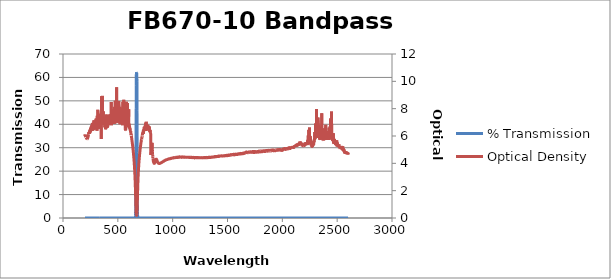
| Category | % Transmission |
|---|---|
| 2600.0 | 0.002 |
| 2599.0 | 0.002 |
| 2598.0 | 0.002 |
| 2597.0 | 0.002 |
| 2596.0 | 0.002 |
| 2595.0 | 0.002 |
| 2594.0 | 0.002 |
| 2593.0 | 0.002 |
| 2592.0 | 0.002 |
| 2591.0 | 0.002 |
| 2590.0 | 0.002 |
| 2589.0 | 0.002 |
| 2588.0 | 0.002 |
| 2587.0 | 0.002 |
| 2586.0 | 0.001 |
| 2585.0 | 0.002 |
| 2584.0 | 0.002 |
| 2583.0 | 0.002 |
| 2582.0 | 0.002 |
| 2581.0 | 0.002 |
| 2580.0 | 0.002 |
| 2579.0 | 0.002 |
| 2578.0 | 0.002 |
| 2577.0 | 0.001 |
| 2576.0 | 0.002 |
| 2575.0 | 0.002 |
| 2574.0 | 0.002 |
| 2573.0 | 0.002 |
| 2572.0 | 0.002 |
| 2571.0 | 0.002 |
| 2570.0 | 0.001 |
| 2569.0 | 0.002 |
| 2568.0 | 0.001 |
| 2567.0 | 0.002 |
| 2566.0 | 0.002 |
| 2565.0 | 0.001 |
| 2564.0 | 0.001 |
| 2563.0 | 0.001 |
| 2562.0 | 0.001 |
| 2561.0 | 0.001 |
| 2560.0 | 0.001 |
| 2559.0 | 0.001 |
| 2558.0 | 0.001 |
| 2557.0 | 0.001 |
| 2556.0 | 0.001 |
| 2555.0 | 0.001 |
| 2554.0 | 0.001 |
| 2553.0 | 0.001 |
| 2552.0 | 0.001 |
| 2551.0 | 0.001 |
| 2550.0 | 0.001 |
| 2549.0 | 0.001 |
| 2548.0 | 0.001 |
| 2547.0 | 0.001 |
| 2546.0 | 0.001 |
| 2545.0 | 0.001 |
| 2544.0 | 0.001 |
| 2543.0 | 0.001 |
| 2542.0 | 0.001 |
| 2541.0 | 0.001 |
| 2540.0 | 0.001 |
| 2539.0 | 0.001 |
| 2538.0 | 0.001 |
| 2537.0 | 0.001 |
| 2536.0 | 0.001 |
| 2535.0 | 0.001 |
| 2534.0 | 0.001 |
| 2533.0 | 0.001 |
| 2532.0 | 0.001 |
| 2531.0 | 0.001 |
| 2530.0 | 0.001 |
| 2529.0 | 0.001 |
| 2528.0 | 0.001 |
| 2527.0 | 0.001 |
| 2526.0 | 0.001 |
| 2525.0 | 0.001 |
| 2524.0 | 0.001 |
| 2523.0 | 0.001 |
| 2522.0 | 0.001 |
| 2521.0 | 0.001 |
| 2520.0 | 0.001 |
| 2519.0 | 0.001 |
| 2518.0 | 0.001 |
| 2517.0 | 0.001 |
| 2516.0 | 0 |
| 2515.0 | 0.001 |
| 2514.0 | 0.001 |
| 2513.0 | 0.001 |
| 2512.0 | 0 |
| 2511.0 | 0.001 |
| 2510.0 | 0 |
| 2509.0 | 0.001 |
| 2508.0 | 0.001 |
| 2507.0 | 0 |
| 2506.0 | 0.001 |
| 2505.0 | 0.001 |
| 2504.0 | 0 |
| 2503.0 | 0 |
| 2502.0 | 0 |
| 2501.0 | 0 |
| 2500.0 | 0 |
| 2499.0 | 0.001 |
| 2498.0 | 0.001 |
| 2497.0 | 0 |
| 2496.0 | 0 |
| 2495.0 | 0 |
| 2494.0 | 0 |
| 2493.0 | 0 |
| 2492.0 | 0 |
| 2491.0 | 0 |
| 2490.0 | 0 |
| 2489.0 | 0 |
| 2488.0 | 0 |
| 2487.0 | 0 |
| 2486.0 | 0 |
| 2485.0 | 0 |
| 2484.0 | 0 |
| 2483.0 | 0 |
| 2482.0 | 0 |
| 2481.0 | 0 |
| 2480.0 | 0 |
| 2479.0 | 0 |
| 2478.0 | 0 |
| 2477.0 | 0 |
| 2476.0 | 0 |
| 2475.0 | 0 |
| 2474.0 | 0 |
| 2473.0 | 0 |
| 2472.0 | 0 |
| 2471.0 | 0 |
| 2470.0 | 0 |
| 2469.0 | 0 |
| 2468.0 | 0 |
| 2467.0 | 0 |
| 2466.0 | 0 |
| 2465.0 | 0 |
| 2464.0 | 0 |
| 2463.0 | 0 |
| 2462.0 | 0 |
| 2461.0 | 0 |
| 2460.0 | 0 |
| 2459.0 | 0 |
| 2458.0 | 0 |
| 2457.0 | 0 |
| 2456.0 | 0 |
| 2455.0 | 0 |
| 2454.0 | 0 |
| 2453.0 | 0 |
| 2452.0 | 0 |
| 2451.0 | 0 |
| 2450.0 | 0 |
| 2449.0 | 0 |
| 2448.0 | 0 |
| 2447.0 | 0 |
| 2446.0 | 0 |
| 2445.0 | 0 |
| 2444.0 | 0 |
| 2443.0 | 0 |
| 2442.0 | 0 |
| 2441.0 | 0 |
| 2440.0 | 0 |
| 2439.0 | 0 |
| 2438.0 | 0 |
| 2437.0 | 0 |
| 2436.0 | 0 |
| 2435.0 | 0 |
| 2434.0 | 0 |
| 2433.0 | 0 |
| 2432.0 | 0 |
| 2431.0 | 0 |
| 2430.0 | 0 |
| 2429.0 | 0 |
| 2428.0 | 0 |
| 2427.0 | 0 |
| 2426.0 | 0 |
| 2425.0 | 0 |
| 2424.0 | 0 |
| 2423.0 | 0 |
| 2422.0 | 0 |
| 2421.0 | 0 |
| 2420.0 | 0 |
| 2419.0 | 0 |
| 2418.0 | 0 |
| 2417.0 | 0 |
| 2416.0 | 0 |
| 2415.0 | 0 |
| 2414.0 | 0 |
| 2413.0 | 0 |
| 2412.0 | 0 |
| 2411.0 | 0 |
| 2410.0 | 0 |
| 2409.0 | 0 |
| 2408.0 | 0 |
| 2407.0 | 0 |
| 2406.0 | 0 |
| 2405.0 | 0 |
| 2404.0 | 0 |
| 2403.0 | 0 |
| 2402.0 | 0 |
| 2401.0 | 0 |
| 2400.0 | 0 |
| 2399.0 | 0 |
| 2398.0 | 0 |
| 2397.0 | 0 |
| 2396.0 | 0 |
| 2395.0 | 0 |
| 2394.0 | 0 |
| 2393.0 | 0 |
| 2392.0 | 0 |
| 2391.0 | 0 |
| 2390.0 | 0 |
| 2389.0 | 0 |
| 2388.0 | 0 |
| 2387.0 | 0 |
| 2386.0 | 0 |
| 2385.0 | 0 |
| 2384.0 | 0 |
| 2383.0 | 0 |
| 2382.0 | 0 |
| 2381.0 | 0 |
| 2380.0 | 0 |
| 2379.0 | 0 |
| 2378.0 | 0 |
| 2377.0 | 0 |
| 2376.0 | 0 |
| 2375.0 | 0 |
| 2374.0 | 0 |
| 2373.0 | 0 |
| 2372.0 | 0 |
| 2371.0 | 0 |
| 2370.0 | 0 |
| 2369.0 | 0 |
| 2368.0 | 0 |
| 2367.0 | 0 |
| 2366.0 | 0 |
| 2365.0 | 0 |
| 2364.0 | 0 |
| 2363.0 | 0 |
| 2362.0 | 0 |
| 2361.0 | 0 |
| 2360.0 | 0 |
| 2359.0 | 0 |
| 2358.0 | 0 |
| 2357.0 | 0 |
| 2356.0 | 0 |
| 2355.0 | 0 |
| 2354.0 | 0 |
| 2353.0 | 0 |
| 2352.0 | 0 |
| 2351.0 | 0 |
| 2350.0 | 0 |
| 2349.0 | 0 |
| 2348.0 | 0 |
| 2347.0 | 0 |
| 2346.0 | 0 |
| 2345.0 | 0 |
| 2344.0 | 0 |
| 2343.0 | 0 |
| 2342.0 | 0 |
| 2341.0 | 0 |
| 2340.0 | 0 |
| 2339.0 | 0 |
| 2338.0 | 0 |
| 2337.0 | 0 |
| 2336.0 | 0 |
| 2335.0 | 0 |
| 2334.0 | 0 |
| 2333.0 | 0 |
| 2332.0 | 0 |
| 2331.0 | 0 |
| 2330.0 | 0 |
| 2329.0 | 0 |
| 2328.0 | 0 |
| 2327.0 | 0 |
| 2326.0 | 0 |
| 2325.0 | 0 |
| 2324.0 | 0 |
| 2323.0 | 0 |
| 2322.0 | 0 |
| 2321.0 | 0 |
| 2320.0 | 0 |
| 2319.0 | 0 |
| 2318.0 | 0 |
| 2317.0 | 0 |
| 2316.0 | 0 |
| 2315.0 | 0 |
| 2314.0 | 0 |
| 2313.0 | 0 |
| 2312.0 | 0 |
| 2311.0 | 0 |
| 2310.0 | 0 |
| 2309.0 | 0 |
| 2308.0 | 0 |
| 2307.0 | 0 |
| 2306.0 | 0 |
| 2305.0 | 0 |
| 2304.0 | 0 |
| 2303.0 | 0 |
| 2302.0 | 0 |
| 2301.0 | 0 |
| 2300.0 | 0 |
| 2299.0 | 0 |
| 2298.0 | 0 |
| 2297.0 | 0 |
| 2296.0 | 0 |
| 2295.0 | 0 |
| 2294.0 | 0 |
| 2293.0 | 0 |
| 2292.0 | 0 |
| 2291.0 | 0 |
| 2290.0 | 0 |
| 2289.0 | 0 |
| 2288.0 | 0 |
| 2287.0 | 0 |
| 2286.0 | 0 |
| 2285.0 | 0 |
| 2284.0 | 0 |
| 2283.0 | 0 |
| 2282.0 | 0 |
| 2281.0 | 0 |
| 2280.0 | 0 |
| 2279.0 | 0 |
| 2278.0 | 0 |
| 2277.0 | 0 |
| 2276.0 | 0.001 |
| 2275.0 | 0 |
| 2274.0 | 0.001 |
| 2273.0 | 0.001 |
| 2272.0 | 0.001 |
| 2271.0 | 0.001 |
| 2270.0 | 0.001 |
| 2269.0 | 0 |
| 2268.0 | 0.001 |
| 2267.0 | 0 |
| 2266.0 | 0 |
| 2265.0 | 0 |
| 2264.0 | 0 |
| 2263.0 | 0 |
| 2262.0 | 0 |
| 2261.0 | 0 |
| 2260.0 | 0 |
| 2259.0 | 0 |
| 2258.0 | 0 |
| 2257.0 | 0 |
| 2256.0 | 0 |
| 2255.0 | 0 |
| 2254.0 | 0 |
| 2253.0 | 0 |
| 2252.0 | 0 |
| 2251.0 | 0 |
| 2250.0 | 0 |
| 2249.0 | 0 |
| 2248.0 | 0 |
| 2247.0 | 0 |
| 2246.0 | 0 |
| 2245.0 | 0 |
| 2244.0 | 0 |
| 2243.0 | 0 |
| 2242.0 | 0 |
| 2241.0 | 0 |
| 2240.0 | 0 |
| 2239.0 | 0 |
| 2238.0 | 0 |
| 2237.0 | 0 |
| 2236.0 | 0 |
| 2235.0 | 0 |
| 2234.0 | 0 |
| 2233.0 | 0 |
| 2232.0 | 0 |
| 2231.0 | 0 |
| 2230.0 | 0 |
| 2229.0 | 0 |
| 2228.0 | 0 |
| 2227.0 | 0 |
| 2226.0 | 0 |
| 2225.0 | 0 |
| 2224.0 | 0 |
| 2223.0 | 0 |
| 2222.0 | 0 |
| 2221.0 | 0 |
| 2220.0 | 0 |
| 2219.0 | 0 |
| 2218.0 | 0 |
| 2217.0 | 0 |
| 2216.0 | 0 |
| 2215.0 | 0 |
| 2214.0 | 0 |
| 2213.0 | 0 |
| 2212.0 | 0 |
| 2211.0 | 0 |
| 2210.0 | 0 |
| 2209.0 | 0 |
| 2208.0 | 0 |
| 2207.0 | 0.001 |
| 2206.0 | 0.001 |
| 2205.0 | 0 |
| 2204.0 | 0 |
| 2203.0 | 0 |
| 2202.0 | 0 |
| 2201.0 | 0 |
| 2200.0 | 0.001 |
| 2199.0 | 0 |
| 2198.0 | 0.001 |
| 2197.0 | 0 |
| 2196.0 | 0 |
| 2195.0 | 0 |
| 2194.0 | 0 |
| 2193.0 | 0 |
| 2192.0 | 0 |
| 2191.0 | 0 |
| 2190.0 | 0 |
| 2189.0 | 0.001 |
| 2188.0 | 0 |
| 2187.0 | 0 |
| 2186.0 | 0.001 |
| 2185.0 | 0 |
| 2184.0 | 0 |
| 2183.0 | 0 |
| 2182.0 | 0 |
| 2181.0 | 0 |
| 2180.0 | 0 |
| 2179.0 | 0 |
| 2178.0 | 0 |
| 2177.0 | 0 |
| 2176.0 | 0 |
| 2175.0 | 0 |
| 2174.0 | 0 |
| 2173.0 | 0 |
| 2172.0 | 0 |
| 2171.0 | 0 |
| 2170.0 | 0 |
| 2169.0 | 0 |
| 2168.0 | 0 |
| 2167.0 | 0 |
| 2166.0 | 0 |
| 2165.0 | 0 |
| 2164.0 | 0 |
| 2163.0 | 0 |
| 2162.0 | 0 |
| 2161.0 | 0 |
| 2160.0 | 0 |
| 2159.0 | 0 |
| 2158.0 | 0 |
| 2157.0 | 0 |
| 2156.0 | 0 |
| 2155.0 | 0 |
| 2154.0 | 0 |
| 2153.0 | 0 |
| 2152.0 | 0 |
| 2151.0 | 0 |
| 2150.0 | 0 |
| 2149.0 | 0 |
| 2148.0 | 0 |
| 2147.0 | 0 |
| 2146.0 | 0 |
| 2145.0 | 0 |
| 2144.0 | 0 |
| 2143.0 | 0 |
| 2142.0 | 0 |
| 2141.0 | 0 |
| 2140.0 | 0 |
| 2139.0 | 0 |
| 2138.0 | 0 |
| 2137.0 | 0 |
| 2136.0 | 0 |
| 2135.0 | 0 |
| 2134.0 | 0 |
| 2133.0 | 0.001 |
| 2132.0 | 0 |
| 2131.0 | 0 |
| 2130.0 | 0 |
| 2129.0 | 0 |
| 2128.0 | 0 |
| 2127.0 | 0.001 |
| 2126.0 | 0 |
| 2125.0 | 0.001 |
| 2124.0 | 0.001 |
| 2123.0 | 0.001 |
| 2122.0 | 0.001 |
| 2121.0 | 0 |
| 2120.0 | 0.001 |
| 2119.0 | 0 |
| 2118.0 | 0.001 |
| 2117.0 | 0.001 |
| 2116.0 | 0.001 |
| 2115.0 | 0.001 |
| 2114.0 | 0.001 |
| 2113.0 | 0.001 |
| 2112.0 | 0.001 |
| 2111.0 | 0.001 |
| 2110.0 | 0.001 |
| 2109.0 | 0.001 |
| 2108.0 | 0.001 |
| 2107.0 | 0.001 |
| 2106.0 | 0.001 |
| 2105.0 | 0.001 |
| 2104.0 | 0.001 |
| 2103.0 | 0.001 |
| 2102.0 | 0.001 |
| 2101.0 | 0.001 |
| 2100.0 | 0.001 |
| 2099.0 | 0.001 |
| 2098.0 | 0.001 |
| 2097.0 | 0.001 |
| 2096.0 | 0.001 |
| 2095.0 | 0.001 |
| 2094.0 | 0.001 |
| 2093.0 | 0.001 |
| 2092.0 | 0.001 |
| 2091.0 | 0.001 |
| 2090.0 | 0.001 |
| 2089.0 | 0.001 |
| 2088.0 | 0.001 |
| 2087.0 | 0.001 |
| 2086.0 | 0.001 |
| 2085.0 | 0.001 |
| 2084.0 | 0.001 |
| 2083.0 | 0.001 |
| 2082.0 | 0.001 |
| 2081.0 | 0.001 |
| 2080.0 | 0.001 |
| 2079.0 | 0.001 |
| 2078.0 | 0.001 |
| 2077.0 | 0.001 |
| 2076.0 | 0.001 |
| 2075.0 | 0.001 |
| 2074.0 | 0.001 |
| 2073.0 | 0.001 |
| 2072.0 | 0.001 |
| 2071.0 | 0.001 |
| 2070.0 | 0.001 |
| 2069.0 | 0.001 |
| 2068.0 | 0.001 |
| 2067.0 | 0.001 |
| 2066.0 | 0.001 |
| 2065.0 | 0.001 |
| 2064.0 | 0.001 |
| 2063.0 | 0.001 |
| 2062.0 | 0.001 |
| 2061.0 | 0.001 |
| 2060.0 | 0.001 |
| 2059.0 | 0.001 |
| 2058.0 | 0.001 |
| 2057.0 | 0.001 |
| 2056.0 | 0.001 |
| 2055.0 | 0.001 |
| 2054.0 | 0.001 |
| 2053.0 | 0.001 |
| 2052.0 | 0.001 |
| 2051.0 | 0.001 |
| 2050.0 | 0.001 |
| 2049.0 | 0.001 |
| 2048.0 | 0.001 |
| 2047.0 | 0.001 |
| 2046.0 | 0.001 |
| 2045.0 | 0.001 |
| 2044.0 | 0.001 |
| 2043.0 | 0.001 |
| 2042.0 | 0.001 |
| 2041.0 | 0.001 |
| 2040.0 | 0.001 |
| 2039.0 | 0.001 |
| 2038.0 | 0.001 |
| 2037.0 | 0.001 |
| 2036.0 | 0.001 |
| 2035.0 | 0.001 |
| 2034.0 | 0.001 |
| 2033.0 | 0.001 |
| 2032.0 | 0.001 |
| 2031.0 | 0.001 |
| 2030.0 | 0.001 |
| 2029.0 | 0.001 |
| 2028.0 | 0.001 |
| 2027.0 | 0.001 |
| 2026.0 | 0.001 |
| 2025.0 | 0.001 |
| 2024.0 | 0.001 |
| 2023.0 | 0.001 |
| 2022.0 | 0.001 |
| 2021.0 | 0.001 |
| 2020.0 | 0.001 |
| 2019.0 | 0.001 |
| 2018.0 | 0.001 |
| 2017.0 | 0.001 |
| 2016.0 | 0.001 |
| 2015.0 | 0.001 |
| 2014.0 | 0.001 |
| 2013.0 | 0.001 |
| 2012.0 | 0.001 |
| 2011.0 | 0.001 |
| 2010.0 | 0.001 |
| 2009.0 | 0.001 |
| 2008.0 | 0.001 |
| 2007.0 | 0.001 |
| 2006.0 | 0.001 |
| 2005.0 | 0.001 |
| 2004.0 | 0.001 |
| 2003.0 | 0.001 |
| 2002.0 | 0.001 |
| 2001.0 | 0.001 |
| 2000.0 | 0.001 |
| 1999.0 | 0.001 |
| 1998.0 | 0.001 |
| 1997.0 | 0.001 |
| 1996.0 | 0.001 |
| 1995.0 | 0.001 |
| 1994.0 | 0.001 |
| 1993.0 | 0.001 |
| 1992.0 | 0.001 |
| 1991.0 | 0.001 |
| 1990.0 | 0.001 |
| 1989.0 | 0.001 |
| 1988.0 | 0.001 |
| 1987.0 | 0.001 |
| 1986.0 | 0.001 |
| 1985.0 | 0.001 |
| 1984.0 | 0.001 |
| 1983.0 | 0.001 |
| 1982.0 | 0.001 |
| 1981.0 | 0.001 |
| 1980.0 | 0.001 |
| 1979.0 | 0.001 |
| 1978.0 | 0.001 |
| 1977.0 | 0.001 |
| 1976.0 | 0.001 |
| 1975.0 | 0.001 |
| 1974.0 | 0.001 |
| 1973.0 | 0.001 |
| 1972.0 | 0.001 |
| 1971.0 | 0.001 |
| 1970.0 | 0.001 |
| 1969.0 | 0.001 |
| 1968.0 | 0.001 |
| 1967.0 | 0.001 |
| 1966.0 | 0.001 |
| 1965.0 | 0.001 |
| 1964.0 | 0.001 |
| 1963.0 | 0.001 |
| 1962.0 | 0.001 |
| 1961.0 | 0.001 |
| 1960.0 | 0.001 |
| 1959.0 | 0.001 |
| 1958.0 | 0.001 |
| 1957.0 | 0.001 |
| 1956.0 | 0.001 |
| 1955.0 | 0.001 |
| 1954.0 | 0.001 |
| 1953.0 | 0.001 |
| 1952.0 | 0.001 |
| 1951.0 | 0.001 |
| 1950.0 | 0.001 |
| 1949.0 | 0.001 |
| 1948.0 | 0.001 |
| 1947.0 | 0.001 |
| 1946.0 | 0.001 |
| 1945.0 | 0.001 |
| 1944.0 | 0.001 |
| 1943.0 | 0.001 |
| 1942.0 | 0.001 |
| 1941.0 | 0.001 |
| 1940.0 | 0.001 |
| 1939.0 | 0.001 |
| 1938.0 | 0.001 |
| 1937.0 | 0.001 |
| 1936.0 | 0.001 |
| 1935.0 | 0.001 |
| 1934.0 | 0.001 |
| 1933.0 | 0.001 |
| 1932.0 | 0.001 |
| 1931.0 | 0.001 |
| 1930.0 | 0.001 |
| 1929.0 | 0.001 |
| 1928.0 | 0.001 |
| 1927.0 | 0.001 |
| 1926.0 | 0.001 |
| 1925.0 | 0.001 |
| 1924.0 | 0.001 |
| 1923.0 | 0.001 |
| 1922.0 | 0.001 |
| 1921.0 | 0.001 |
| 1920.0 | 0.001 |
| 1919.0 | 0.001 |
| 1918.0 | 0.001 |
| 1917.0 | 0.001 |
| 1916.0 | 0.001 |
| 1915.0 | 0.001 |
| 1914.0 | 0.001 |
| 1913.0 | 0.001 |
| 1912.0 | 0.001 |
| 1911.0 | 0.001 |
| 1910.0 | 0.001 |
| 1909.0 | 0.001 |
| 1908.0 | 0.001 |
| 1907.0 | 0.001 |
| 1906.0 | 0.001 |
| 1905.0 | 0.001 |
| 1904.0 | 0.001 |
| 1903.0 | 0.001 |
| 1902.0 | 0.001 |
| 1901.0 | 0.001 |
| 1900.0 | 0.001 |
| 1899.0 | 0.001 |
| 1898.0 | 0.001 |
| 1897.0 | 0.001 |
| 1896.0 | 0.001 |
| 1895.0 | 0.001 |
| 1894.0 | 0.001 |
| 1893.0 | 0.001 |
| 1892.0 | 0.001 |
| 1891.0 | 0.001 |
| 1890.0 | 0.001 |
| 1889.0 | 0.001 |
| 1888.0 | 0.001 |
| 1887.0 | 0.001 |
| 1886.0 | 0.001 |
| 1885.0 | 0.001 |
| 1884.0 | 0.001 |
| 1883.0 | 0.001 |
| 1882.0 | 0.001 |
| 1881.0 | 0.001 |
| 1880.0 | 0.001 |
| 1879.0 | 0.001 |
| 1878.0 | 0.001 |
| 1877.0 | 0.001 |
| 1876.0 | 0.001 |
| 1875.0 | 0.001 |
| 1874.0 | 0.001 |
| 1873.0 | 0.001 |
| 1872.0 | 0.001 |
| 1871.0 | 0.001 |
| 1870.0 | 0.001 |
| 1869.0 | 0.001 |
| 1868.0 | 0.001 |
| 1867.0 | 0.001 |
| 1866.0 | 0.001 |
| 1865.0 | 0.001 |
| 1864.0 | 0.001 |
| 1863.0 | 0.001 |
| 1862.0 | 0.001 |
| 1861.0 | 0.001 |
| 1860.0 | 0.001 |
| 1859.0 | 0.001 |
| 1858.0 | 0.001 |
| 1857.0 | 0.001 |
| 1856.0 | 0.001 |
| 1855.0 | 0.001 |
| 1854.0 | 0.001 |
| 1853.0 | 0.001 |
| 1852.0 | 0.001 |
| 1851.0 | 0.001 |
| 1850.0 | 0.001 |
| 1849.0 | 0.001 |
| 1848.0 | 0.001 |
| 1847.0 | 0.001 |
| 1846.0 | 0.001 |
| 1845.0 | 0.001 |
| 1844.0 | 0.001 |
| 1843.0 | 0.001 |
| 1842.0 | 0.001 |
| 1841.0 | 0.001 |
| 1840.0 | 0.001 |
| 1839.0 | 0.001 |
| 1838.0 | 0.001 |
| 1837.0 | 0.001 |
| 1836.0 | 0.001 |
| 1835.0 | 0.001 |
| 1834.0 | 0.001 |
| 1833.0 | 0.001 |
| 1832.0 | 0.001 |
| 1831.0 | 0.001 |
| 1830.0 | 0.001 |
| 1829.0 | 0.001 |
| 1828.0 | 0.001 |
| 1827.0 | 0.001 |
| 1826.0 | 0.001 |
| 1825.0 | 0.001 |
| 1824.0 | 0.001 |
| 1823.0 | 0.001 |
| 1822.0 | 0.001 |
| 1821.0 | 0.001 |
| 1820.0 | 0.001 |
| 1819.0 | 0.001 |
| 1818.0 | 0.001 |
| 1817.0 | 0.001 |
| 1816.0 | 0.001 |
| 1815.0 | 0.001 |
| 1814.0 | 0.001 |
| 1813.0 | 0.001 |
| 1812.0 | 0.001 |
| 1811.0 | 0.001 |
| 1810.0 | 0.001 |
| 1809.0 | 0.001 |
| 1808.0 | 0.001 |
| 1807.0 | 0.001 |
| 1806.0 | 0.001 |
| 1805.0 | 0.001 |
| 1804.0 | 0.001 |
| 1803.0 | 0.001 |
| 1802.0 | 0.001 |
| 1801.0 | 0.001 |
| 1800.0 | 0.001 |
| 1799.0 | 0.001 |
| 1798.0 | 0.001 |
| 1797.0 | 0.001 |
| 1796.0 | 0.001 |
| 1795.0 | 0.001 |
| 1794.0 | 0.001 |
| 1793.0 | 0.001 |
| 1792.0 | 0.001 |
| 1791.0 | 0.001 |
| 1790.0 | 0.001 |
| 1789.0 | 0.001 |
| 1788.0 | 0.001 |
| 1787.0 | 0.002 |
| 1786.0 | 0.001 |
| 1785.0 | 0.001 |
| 1784.0 | 0.001 |
| 1783.0 | 0.001 |
| 1782.0 | 0.001 |
| 1781.0 | 0.001 |
| 1780.0 | 0.001 |
| 1779.0 | 0.002 |
| 1778.0 | 0.001 |
| 1777.0 | 0.001 |
| 1776.0 | 0.001 |
| 1775.0 | 0.001 |
| 1774.0 | 0.001 |
| 1773.0 | 0.002 |
| 1772.0 | 0.001 |
| 1771.0 | 0.001 |
| 1770.0 | 0.001 |
| 1769.0 | 0.001 |
| 1768.0 | 0.001 |
| 1767.0 | 0.001 |
| 1766.0 | 0.002 |
| 1765.0 | 0.001 |
| 1764.0 | 0.002 |
| 1763.0 | 0.002 |
| 1762.0 | 0.001 |
| 1761.0 | 0.002 |
| 1760.0 | 0.001 |
| 1759.0 | 0.001 |
| 1758.0 | 0.002 |
| 1757.0 | 0.002 |
| 1756.0 | 0.002 |
| 1755.0 | 0.002 |
| 1754.0 | 0.001 |
| 1753.0 | 0.002 |
| 1752.0 | 0.001 |
| 1751.0 | 0.001 |
| 1750.0 | 0.002 |
| 1749.0 | 0.002 |
| 1748.0 | 0.002 |
| 1747.0 | 0.002 |
| 1746.0 | 0.001 |
| 1745.0 | 0.001 |
| 1744.0 | 0.001 |
| 1743.0 | 0.002 |
| 1742.0 | 0.001 |
| 1741.0 | 0.002 |
| 1740.0 | 0.002 |
| 1739.0 | 0.001 |
| 1738.0 | 0.001 |
| 1737.0 | 0.001 |
| 1736.0 | 0.002 |
| 1735.0 | 0.001 |
| 1734.0 | 0.001 |
| 1733.0 | 0.002 |
| 1732.0 | 0.001 |
| 1731.0 | 0.002 |
| 1730.0 | 0.001 |
| 1729.0 | 0.001 |
| 1728.0 | 0.001 |
| 1727.0 | 0.001 |
| 1726.0 | 0.002 |
| 1725.0 | 0.001 |
| 1724.0 | 0.002 |
| 1723.0 | 0.001 |
| 1722.0 | 0.002 |
| 1721.0 | 0.002 |
| 1720.0 | 0.001 |
| 1719.0 | 0.001 |
| 1718.0 | 0.001 |
| 1717.0 | 0.001 |
| 1716.0 | 0.001 |
| 1715.0 | 0.002 |
| 1714.0 | 0.002 |
| 1713.0 | 0.002 |
| 1712.0 | 0.001 |
| 1711.0 | 0.002 |
| 1710.0 | 0.002 |
| 1709.0 | 0.001 |
| 1708.0 | 0.001 |
| 1707.0 | 0.001 |
| 1706.0 | 0.001 |
| 1705.0 | 0.002 |
| 1704.0 | 0.001 |
| 1703.0 | 0.001 |
| 1702.0 | 0.002 |
| 1701.0 | 0.001 |
| 1700.0 | 0.002 |
| 1699.0 | 0.002 |
| 1698.0 | 0.002 |
| 1697.0 | 0.001 |
| 1696.0 | 0.001 |
| 1695.0 | 0.001 |
| 1694.0 | 0.002 |
| 1693.0 | 0.002 |
| 1692.0 | 0.002 |
| 1691.0 | 0.002 |
| 1690.0 | 0.002 |
| 1689.0 | 0.002 |
| 1688.0 | 0.002 |
| 1687.0 | 0.002 |
| 1686.0 | 0.002 |
| 1685.0 | 0.002 |
| 1684.0 | 0.002 |
| 1683.0 | 0.002 |
| 1682.0 | 0.002 |
| 1681.0 | 0.002 |
| 1680.0 | 0.002 |
| 1679.0 | 0.002 |
| 1678.0 | 0.002 |
| 1677.0 | 0.002 |
| 1676.0 | 0.002 |
| 1675.0 | 0.002 |
| 1674.0 | 0.002 |
| 1673.0 | 0.002 |
| 1672.0 | 0.001 |
| 1671.0 | 0.002 |
| 1670.0 | 0.002 |
| 1669.0 | 0.002 |
| 1668.0 | 0.002 |
| 1667.0 | 0.002 |
| 1666.0 | 0.002 |
| 1665.0 | 0.002 |
| 1664.0 | 0.002 |
| 1663.0 | 0.002 |
| 1662.0 | 0.002 |
| 1661.0 | 0.002 |
| 1660.0 | 0.002 |
| 1659.0 | 0.002 |
| 1658.0 | 0.002 |
| 1657.0 | 0.002 |
| 1656.0 | 0.002 |
| 1655.0 | 0.002 |
| 1654.0 | 0.002 |
| 1653.0 | 0.002 |
| 1652.0 | 0.002 |
| 1651.0 | 0.002 |
| 1650.0 | 0.002 |
| 1649.0 | 0.002 |
| 1648.0 | 0.002 |
| 1647.0 | 0.002 |
| 1646.0 | 0.002 |
| 1645.0 | 0.002 |
| 1644.0 | 0.002 |
| 1643.0 | 0.002 |
| 1642.0 | 0.002 |
| 1641.0 | 0.002 |
| 1640.0 | 0.002 |
| 1639.0 | 0.002 |
| 1638.0 | 0.002 |
| 1637.0 | 0.002 |
| 1636.0 | 0.002 |
| 1635.0 | 0.002 |
| 1634.0 | 0.002 |
| 1633.0 | 0.002 |
| 1632.0 | 0.002 |
| 1631.0 | 0.002 |
| 1630.0 | 0.002 |
| 1629.0 | 0.002 |
| 1628.0 | 0.002 |
| 1627.0 | 0.002 |
| 1626.0 | 0.002 |
| 1625.0 | 0.002 |
| 1624.0 | 0.002 |
| 1623.0 | 0.002 |
| 1622.0 | 0.002 |
| 1621.0 | 0.002 |
| 1620.0 | 0.002 |
| 1619.0 | 0.002 |
| 1618.0 | 0.002 |
| 1617.0 | 0.002 |
| 1616.0 | 0.002 |
| 1615.0 | 0.002 |
| 1614.0 | 0.002 |
| 1613.0 | 0.002 |
| 1612.0 | 0.002 |
| 1611.0 | 0.002 |
| 1610.0 | 0.002 |
| 1609.0 | 0.002 |
| 1608.0 | 0.002 |
| 1607.0 | 0.002 |
| 1606.0 | 0.002 |
| 1605.0 | 0.002 |
| 1604.0 | 0.002 |
| 1603.0 | 0.002 |
| 1602.0 | 0.002 |
| 1601.0 | 0.002 |
| 1600.0 | 0.002 |
| 1599.0 | 0.002 |
| 1598.0 | 0.002 |
| 1597.0 | 0.002 |
| 1596.0 | 0.002 |
| 1595.0 | 0.002 |
| 1594.0 | 0.002 |
| 1593.0 | 0.002 |
| 1592.0 | 0.002 |
| 1591.0 | 0.002 |
| 1590.0 | 0.002 |
| 1589.0 | 0.002 |
| 1588.0 | 0.002 |
| 1587.0 | 0.002 |
| 1586.0 | 0.002 |
| 1585.0 | 0.002 |
| 1584.0 | 0.002 |
| 1583.0 | 0.002 |
| 1582.0 | 0.002 |
| 1581.0 | 0.002 |
| 1580.0 | 0.002 |
| 1579.0 | 0.002 |
| 1578.0 | 0.002 |
| 1577.0 | 0.002 |
| 1576.0 | 0.002 |
| 1575.0 | 0.002 |
| 1574.0 | 0.002 |
| 1573.0 | 0.002 |
| 1572.0 | 0.002 |
| 1571.0 | 0.002 |
| 1570.0 | 0.002 |
| 1569.0 | 0.002 |
| 1568.0 | 0.002 |
| 1567.0 | 0.002 |
| 1566.0 | 0.002 |
| 1565.0 | 0.002 |
| 1564.0 | 0.002 |
| 1563.0 | 0.002 |
| 1562.0 | 0.002 |
| 1561.0 | 0.002 |
| 1560.0 | 0.002 |
| 1559.0 | 0.002 |
| 1558.0 | 0.002 |
| 1557.0 | 0.002 |
| 1556.0 | 0.002 |
| 1555.0 | 0.002 |
| 1554.0 | 0.002 |
| 1553.0 | 0.002 |
| 1552.0 | 0.002 |
| 1551.0 | 0.002 |
| 1550.0 | 0.002 |
| 1549.0 | 0.002 |
| 1548.0 | 0.002 |
| 1547.0 | 0.002 |
| 1546.0 | 0.002 |
| 1545.0 | 0.002 |
| 1544.0 | 0.002 |
| 1543.0 | 0.002 |
| 1542.0 | 0.002 |
| 1541.0 | 0.002 |
| 1540.0 | 0.002 |
| 1539.0 | 0.002 |
| 1538.0 | 0.002 |
| 1537.0 | 0.002 |
| 1536.0 | 0.002 |
| 1535.0 | 0.002 |
| 1534.0 | 0.002 |
| 1533.0 | 0.002 |
| 1532.0 | 0.002 |
| 1531.0 | 0.002 |
| 1530.0 | 0.002 |
| 1529.0 | 0.003 |
| 1528.0 | 0.002 |
| 1527.0 | 0.002 |
| 1526.0 | 0.002 |
| 1525.0 | 0.003 |
| 1524.0 | 0.003 |
| 1523.0 | 0.003 |
| 1522.0 | 0.002 |
| 1521.0 | 0.002 |
| 1520.0 | 0.003 |
| 1519.0 | 0.002 |
| 1518.0 | 0.003 |
| 1517.0 | 0.003 |
| 1516.0 | 0.003 |
| 1515.0 | 0.003 |
| 1514.0 | 0.003 |
| 1513.0 | 0.003 |
| 1512.0 | 0.002 |
| 1511.0 | 0.003 |
| 1510.0 | 0.003 |
| 1509.0 | 0.003 |
| 1508.0 | 0.003 |
| 1507.0 | 0.003 |
| 1506.0 | 0.003 |
| 1505.0 | 0.003 |
| 1504.0 | 0.003 |
| 1503.0 | 0.003 |
| 1502.0 | 0.003 |
| 1501.0 | 0.003 |
| 1500.0 | 0.003 |
| 1499.0 | 0.003 |
| 1498.0 | 0.003 |
| 1497.0 | 0.003 |
| 1496.0 | 0.003 |
| 1495.0 | 0.003 |
| 1494.0 | 0.003 |
| 1493.0 | 0.003 |
| 1492.0 | 0.003 |
| 1491.0 | 0.003 |
| 1490.0 | 0.003 |
| 1489.0 | 0.003 |
| 1488.0 | 0.003 |
| 1487.0 | 0.003 |
| 1486.0 | 0.003 |
| 1485.0 | 0.003 |
| 1484.0 | 0.003 |
| 1483.0 | 0.003 |
| 1482.0 | 0.003 |
| 1481.0 | 0.003 |
| 1480.0 | 0.003 |
| 1479.0 | 0.003 |
| 1478.0 | 0.003 |
| 1477.0 | 0.003 |
| 1476.0 | 0.003 |
| 1475.0 | 0.003 |
| 1474.0 | 0.003 |
| 1473.0 | 0.003 |
| 1472.0 | 0.003 |
| 1471.0 | 0.003 |
| 1470.0 | 0.003 |
| 1469.0 | 0.003 |
| 1468.0 | 0.003 |
| 1467.0 | 0.003 |
| 1466.0 | 0.003 |
| 1465.0 | 0.003 |
| 1464.0 | 0.003 |
| 1463.0 | 0.003 |
| 1462.0 | 0.003 |
| 1461.0 | 0.003 |
| 1460.0 | 0.003 |
| 1459.0 | 0.003 |
| 1458.0 | 0.003 |
| 1457.0 | 0.003 |
| 1456.0 | 0.003 |
| 1455.0 | 0.003 |
| 1454.0 | 0.003 |
| 1453.0 | 0.003 |
| 1452.0 | 0.003 |
| 1451.0 | 0.003 |
| 1450.0 | 0.003 |
| 1449.0 | 0.003 |
| 1448.0 | 0.003 |
| 1447.0 | 0.003 |
| 1446.0 | 0.003 |
| 1445.0 | 0.003 |
| 1444.0 | 0.003 |
| 1443.0 | 0.003 |
| 1442.0 | 0.003 |
| 1441.0 | 0.003 |
| 1440.0 | 0.003 |
| 1439.0 | 0.003 |
| 1438.0 | 0.003 |
| 1437.0 | 0.003 |
| 1436.0 | 0.003 |
| 1435.0 | 0.003 |
| 1434.0 | 0.003 |
| 1433.0 | 0.003 |
| 1432.0 | 0.003 |
| 1431.0 | 0.003 |
| 1430.0 | 0.003 |
| 1429.0 | 0.003 |
| 1428.0 | 0.003 |
| 1427.0 | 0.003 |
| 1426.0 | 0.003 |
| 1425.0 | 0.003 |
| 1424.0 | 0.003 |
| 1423.0 | 0.003 |
| 1422.0 | 0.003 |
| 1421.0 | 0.003 |
| 1420.0 | 0.003 |
| 1419.0 | 0.003 |
| 1418.0 | 0.003 |
| 1417.0 | 0.003 |
| 1416.0 | 0.003 |
| 1415.0 | 0.003 |
| 1414.0 | 0.003 |
| 1413.0 | 0.003 |
| 1412.0 | 0.003 |
| 1411.0 | 0.003 |
| 1410.0 | 0.003 |
| 1409.0 | 0.003 |
| 1408.0 | 0.003 |
| 1407.0 | 0.003 |
| 1406.0 | 0.003 |
| 1405.0 | 0.003 |
| 1404.0 | 0.003 |
| 1403.0 | 0.003 |
| 1402.0 | 0.003 |
| 1401.0 | 0.003 |
| 1400.0 | 0.003 |
| 1399.0 | 0.003 |
| 1398.0 | 0.003 |
| 1397.0 | 0.003 |
| 1396.0 | 0.003 |
| 1395.0 | 0.003 |
| 1394.0 | 0.003 |
| 1393.0 | 0.003 |
| 1392.0 | 0.003 |
| 1391.0 | 0.003 |
| 1390.0 | 0.003 |
| 1389.0 | 0.003 |
| 1388.0 | 0.003 |
| 1387.0 | 0.003 |
| 1386.0 | 0.003 |
| 1385.0 | 0.003 |
| 1384.0 | 0.003 |
| 1383.0 | 0.003 |
| 1382.0 | 0.003 |
| 1381.0 | 0.003 |
| 1380.0 | 0.003 |
| 1379.0 | 0.003 |
| 1378.0 | 0.003 |
| 1377.0 | 0.003 |
| 1376.0 | 0.003 |
| 1375.0 | 0.003 |
| 1374.0 | 0.003 |
| 1373.0 | 0.003 |
| 1372.0 | 0.003 |
| 1371.0 | 0.003 |
| 1370.0 | 0.003 |
| 1369.0 | 0.004 |
| 1368.0 | 0.003 |
| 1367.0 | 0.003 |
| 1366.0 | 0.003 |
| 1365.0 | 0.003 |
| 1364.0 | 0.003 |
| 1363.0 | 0.004 |
| 1362.0 | 0.004 |
| 1361.0 | 0.004 |
| 1360.0 | 0.004 |
| 1359.0 | 0.004 |
| 1358.0 | 0.004 |
| 1357.0 | 0.003 |
| 1356.0 | 0.004 |
| 1355.0 | 0.004 |
| 1354.0 | 0.004 |
| 1353.0 | 0.004 |
| 1352.0 | 0.004 |
| 1351.0 | 0.004 |
| 1350.0 | 0.004 |
| 1349.0 | 0.004 |
| 1348.0 | 0.004 |
| 1347.0 | 0.004 |
| 1346.0 | 0.004 |
| 1345.0 | 0.004 |
| 1344.0 | 0.004 |
| 1343.0 | 0.004 |
| 1342.0 | 0.004 |
| 1341.0 | 0.004 |
| 1340.0 | 0.004 |
| 1339.0 | 0.004 |
| 1338.0 | 0.004 |
| 1337.0 | 0.004 |
| 1336.0 | 0.004 |
| 1335.0 | 0.004 |
| 1334.0 | 0.004 |
| 1333.0 | 0.004 |
| 1332.0 | 0.004 |
| 1331.0 | 0.004 |
| 1330.0 | 0.004 |
| 1329.0 | 0.004 |
| 1328.0 | 0.004 |
| 1327.0 | 0.004 |
| 1326.0 | 0.004 |
| 1325.0 | 0.004 |
| 1324.0 | 0.004 |
| 1323.0 | 0.004 |
| 1322.0 | 0.004 |
| 1321.0 | 0.004 |
| 1320.0 | 0.004 |
| 1319.0 | 0.004 |
| 1318.0 | 0.004 |
| 1317.0 | 0.004 |
| 1316.0 | 0.004 |
| 1315.0 | 0.004 |
| 1314.0 | 0.004 |
| 1313.0 | 0.004 |
| 1312.0 | 0.004 |
| 1311.0 | 0.004 |
| 1310.0 | 0.004 |
| 1309.0 | 0.004 |
| 1308.0 | 0.004 |
| 1307.0 | 0.004 |
| 1306.0 | 0.004 |
| 1305.0 | 0.004 |
| 1304.0 | 0.004 |
| 1303.0 | 0.004 |
| 1302.0 | 0.004 |
| 1301.0 | 0.004 |
| 1300.0 | 0.004 |
| 1299.0 | 0.004 |
| 1298.0 | 0.004 |
| 1297.0 | 0.004 |
| 1296.0 | 0.004 |
| 1295.0 | 0.004 |
| 1294.0 | 0.004 |
| 1293.0 | 0.004 |
| 1292.0 | 0.004 |
| 1291.0 | 0.004 |
| 1290.0 | 0.004 |
| 1289.0 | 0.004 |
| 1288.0 | 0.004 |
| 1287.0 | 0.004 |
| 1286.0 | 0.004 |
| 1285.0 | 0.004 |
| 1284.0 | 0.004 |
| 1283.0 | 0.004 |
| 1282.0 | 0.004 |
| 1281.0 | 0.004 |
| 1280.0 | 0.004 |
| 1279.0 | 0.004 |
| 1278.0 | 0.004 |
| 1277.0 | 0.004 |
| 1276.0 | 0.004 |
| 1275.0 | 0.004 |
| 1274.0 | 0.004 |
| 1273.0 | 0.004 |
| 1272.0 | 0.004 |
| 1271.0 | 0.004 |
| 1270.0 | 0.004 |
| 1269.0 | 0.004 |
| 1268.0 | 0.004 |
| 1267.0 | 0.004 |
| 1266.0 | 0.004 |
| 1265.0 | 0.004 |
| 1264.0 | 0.004 |
| 1263.0 | 0.004 |
| 1262.0 | 0.004 |
| 1261.0 | 0.004 |
| 1260.0 | 0.004 |
| 1259.0 | 0.004 |
| 1258.0 | 0.004 |
| 1257.0 | 0.004 |
| 1256.0 | 0.004 |
| 1255.0 | 0.004 |
| 1254.0 | 0.004 |
| 1253.0 | 0.004 |
| 1252.0 | 0.004 |
| 1251.0 | 0.004 |
| 1250.0 | 0.004 |
| 1249.0 | 0.004 |
| 1248.0 | 0.004 |
| 1247.0 | 0.004 |
| 1246.0 | 0.004 |
| 1245.0 | 0.004 |
| 1244.0 | 0.004 |
| 1243.0 | 0.004 |
| 1242.0 | 0.004 |
| 1241.0 | 0.004 |
| 1240.0 | 0.004 |
| 1239.0 | 0.004 |
| 1238.0 | 0.004 |
| 1237.0 | 0.004 |
| 1236.0 | 0.004 |
| 1235.0 | 0.004 |
| 1234.0 | 0.004 |
| 1233.0 | 0.004 |
| 1232.0 | 0.004 |
| 1231.0 | 0.004 |
| 1230.0 | 0.004 |
| 1229.0 | 0.004 |
| 1228.0 | 0.004 |
| 1227.0 | 0.004 |
| 1226.0 | 0.004 |
| 1225.0 | 0.004 |
| 1224.0 | 0.004 |
| 1223.0 | 0.004 |
| 1222.0 | 0.004 |
| 1221.0 | 0.004 |
| 1220.0 | 0.004 |
| 1219.0 | 0.004 |
| 1218.0 | 0.004 |
| 1217.0 | 0.004 |
| 1216.0 | 0.004 |
| 1215.0 | 0.004 |
| 1214.0 | 0.004 |
| 1213.0 | 0.004 |
| 1212.0 | 0.004 |
| 1211.0 | 0.004 |
| 1210.0 | 0.004 |
| 1209.0 | 0.004 |
| 1208.0 | 0.004 |
| 1207.0 | 0.004 |
| 1206.0 | 0.004 |
| 1205.0 | 0.004 |
| 1204.0 | 0.004 |
| 1203.0 | 0.004 |
| 1202.0 | 0.004 |
| 1201.0 | 0.004 |
| 1200.0 | 0.004 |
| 1199.0 | 0.004 |
| 1198.0 | 0.004 |
| 1197.0 | 0.004 |
| 1196.0 | 0.004 |
| 1195.0 | 0.004 |
| 1194.0 | 0.004 |
| 1193.0 | 0.004 |
| 1192.0 | 0.004 |
| 1191.0 | 0.004 |
| 1190.0 | 0.004 |
| 1189.0 | 0.004 |
| 1188.0 | 0.004 |
| 1187.0 | 0.004 |
| 1186.0 | 0.004 |
| 1185.0 | 0.004 |
| 1184.0 | 0.004 |
| 1183.0 | 0.004 |
| 1182.0 | 0.004 |
| 1181.0 | 0.004 |
| 1180.0 | 0.004 |
| 1179.0 | 0.004 |
| 1178.0 | 0.004 |
| 1177.0 | 0.004 |
| 1176.0 | 0.004 |
| 1175.0 | 0.004 |
| 1174.0 | 0.004 |
| 1173.0 | 0.004 |
| 1172.0 | 0.004 |
| 1171.0 | 0.004 |
| 1170.0 | 0.004 |
| 1169.0 | 0.004 |
| 1168.0 | 0.004 |
| 1167.0 | 0.004 |
| 1166.0 | 0.004 |
| 1165.0 | 0.004 |
| 1164.0 | 0.004 |
| 1163.0 | 0.004 |
| 1162.0 | 0.004 |
| 1161.0 | 0.004 |
| 1160.0 | 0.004 |
| 1159.0 | 0.004 |
| 1158.0 | 0.004 |
| 1157.0 | 0.004 |
| 1156.0 | 0.004 |
| 1155.0 | 0.004 |
| 1154.0 | 0.004 |
| 1153.0 | 0.004 |
| 1152.0 | 0.004 |
| 1151.0 | 0.004 |
| 1150.0 | 0.004 |
| 1149.0 | 0.004 |
| 1148.0 | 0.004 |
| 1147.0 | 0.004 |
| 1146.0 | 0.004 |
| 1145.0 | 0.004 |
| 1144.0 | 0.004 |
| 1143.0 | 0.004 |
| 1142.0 | 0.004 |
| 1141.0 | 0.004 |
| 1140.0 | 0.004 |
| 1139.0 | 0.004 |
| 1138.0 | 0.004 |
| 1137.0 | 0.004 |
| 1136.0 | 0.004 |
| 1135.0 | 0.004 |
| 1134.0 | 0.004 |
| 1133.0 | 0.004 |
| 1132.0 | 0.004 |
| 1131.0 | 0.004 |
| 1130.0 | 0.004 |
| 1129.0 | 0.004 |
| 1128.0 | 0.004 |
| 1127.0 | 0.004 |
| 1126.0 | 0.004 |
| 1125.0 | 0.004 |
| 1124.0 | 0.004 |
| 1123.0 | 0.004 |
| 1122.0 | 0.004 |
| 1121.0 | 0.004 |
| 1120.0 | 0.004 |
| 1119.0 | 0.004 |
| 1118.0 | 0.004 |
| 1117.0 | 0.004 |
| 1116.0 | 0.004 |
| 1115.0 | 0.004 |
| 1114.0 | 0.004 |
| 1113.0 | 0.004 |
| 1112.0 | 0.004 |
| 1111.0 | 0.003 |
| 1110.0 | 0.004 |
| 1109.0 | 0.004 |
| 1108.0 | 0.004 |
| 1107.0 | 0.004 |
| 1106.0 | 0.004 |
| 1105.0 | 0.004 |
| 1104.0 | 0.004 |
| 1103.0 | 0.004 |
| 1102.0 | 0.004 |
| 1101.0 | 0.004 |
| 1100.0 | 0.003 |
| 1099.0 | 0.003 |
| 1098.0 | 0.004 |
| 1097.0 | 0.003 |
| 1096.0 | 0.004 |
| 1095.0 | 0.004 |
| 1094.0 | 0.004 |
| 1093.0 | 0.003 |
| 1092.0 | 0.004 |
| 1091.0 | 0.003 |
| 1090.0 | 0.003 |
| 1089.0 | 0.004 |
| 1088.0 | 0.003 |
| 1087.0 | 0.003 |
| 1086.0 | 0.003 |
| 1085.0 | 0.004 |
| 1084.0 | 0.004 |
| 1083.0 | 0.004 |
| 1082.0 | 0.003 |
| 1081.0 | 0.003 |
| 1080.0 | 0.003 |
| 1079.0 | 0.004 |
| 1078.0 | 0.004 |
| 1077.0 | 0.004 |
| 1076.0 | 0.003 |
| 1075.0 | 0.003 |
| 1074.0 | 0.003 |
| 1073.0 | 0.003 |
| 1072.0 | 0.003 |
| 1071.0 | 0.004 |
| 1070.0 | 0.003 |
| 1069.0 | 0.004 |
| 1068.0 | 0.004 |
| 1067.0 | 0.003 |
| 1066.0 | 0.004 |
| 1065.0 | 0.003 |
| 1064.0 | 0.004 |
| 1063.0 | 0.003 |
| 1062.0 | 0.003 |
| 1061.0 | 0.003 |
| 1060.0 | 0.003 |
| 1059.0 | 0.004 |
| 1058.0 | 0.003 |
| 1057.0 | 0.004 |
| 1056.0 | 0.004 |
| 1055.0 | 0.003 |
| 1054.0 | 0.003 |
| 1053.0 | 0.004 |
| 1052.0 | 0.004 |
| 1051.0 | 0.004 |
| 1050.0 | 0.004 |
| 1049.0 | 0.003 |
| 1048.0 | 0.004 |
| 1047.0 | 0.004 |
| 1046.0 | 0.003 |
| 1045.0 | 0.004 |
| 1044.0 | 0.004 |
| 1043.0 | 0.004 |
| 1042.0 | 0.004 |
| 1041.0 | 0.004 |
| 1040.0 | 0.004 |
| 1039.0 | 0.004 |
| 1038.0 | 0.004 |
| 1037.0 | 0.004 |
| 1036.0 | 0.004 |
| 1035.0 | 0.004 |
| 1034.0 | 0.004 |
| 1033.0 | 0.004 |
| 1032.0 | 0.004 |
| 1031.0 | 0.004 |
| 1030.0 | 0.004 |
| 1029.0 | 0.004 |
| 1028.0 | 0.004 |
| 1027.0 | 0.004 |
| 1026.0 | 0.004 |
| 1025.0 | 0.004 |
| 1024.0 | 0.004 |
| 1023.0 | 0.004 |
| 1022.0 | 0.004 |
| 1021.0 | 0.004 |
| 1020.0 | 0.004 |
| 1019.0 | 0.004 |
| 1018.0 | 0.004 |
| 1017.0 | 0.004 |
| 1016.0 | 0.004 |
| 1015.0 | 0.004 |
| 1014.0 | 0.004 |
| 1013.0 | 0.004 |
| 1012.0 | 0.004 |
| 1011.0 | 0.004 |
| 1010.0 | 0.004 |
| 1009.0 | 0.004 |
| 1008.0 | 0.004 |
| 1007.0 | 0.004 |
| 1006.0 | 0.004 |
| 1005.0 | 0.004 |
| 1004.0 | 0.004 |
| 1003.0 | 0.004 |
| 1002.0 | 0.004 |
| 1001.0 | 0.004 |
| 1000.0 | 0.004 |
| 999.0 | 0.004 |
| 998.0 | 0.004 |
| 997.0 | 0.004 |
| 996.0 | 0.004 |
| 995.0 | 0.004 |
| 994.0 | 0.004 |
| 993.0 | 0.004 |
| 992.0 | 0.004 |
| 991.0 | 0.004 |
| 990.0 | 0.004 |
| 989.0 | 0.004 |
| 988.0 | 0.004 |
| 987.0 | 0.004 |
| 986.0 | 0.004 |
| 985.0 | 0.004 |
| 984.0 | 0.004 |
| 983.0 | 0.004 |
| 982.0 | 0.004 |
| 981.0 | 0.004 |
| 980.0 | 0.004 |
| 979.0 | 0.004 |
| 978.0 | 0.004 |
| 977.0 | 0.004 |
| 976.0 | 0.005 |
| 975.0 | 0.005 |
| 974.0 | 0.005 |
| 973.0 | 0.005 |
| 972.0 | 0.005 |
| 971.0 | 0.005 |
| 970.0 | 0.005 |
| 969.0 | 0.005 |
| 968.0 | 0.005 |
| 967.0 | 0.005 |
| 966.0 | 0.005 |
| 965.0 | 0.005 |
| 964.0 | 0.005 |
| 963.0 | 0.005 |
| 962.0 | 0.005 |
| 961.0 | 0.005 |
| 960.0 | 0.005 |
| 959.0 | 0.005 |
| 958.0 | 0.005 |
| 957.0 | 0.005 |
| 956.0 | 0.005 |
| 955.0 | 0.005 |
| 954.0 | 0.005 |
| 953.0 | 0.005 |
| 952.0 | 0.005 |
| 951.0 | 0.005 |
| 950.0 | 0.005 |
| 949.0 | 0.005 |
| 948.0 | 0.005 |
| 947.0 | 0.005 |
| 946.0 | 0.005 |
| 945.0 | 0.005 |
| 944.0 | 0.005 |
| 943.0 | 0.005 |
| 942.0 | 0.006 |
| 941.0 | 0.006 |
| 940.0 | 0.006 |
| 939.0 | 0.006 |
| 938.0 | 0.006 |
| 937.0 | 0.006 |
| 936.0 | 0.006 |
| 935.0 | 0.006 |
| 934.0 | 0.006 |
| 933.0 | 0.006 |
| 932.0 | 0.006 |
| 931.0 | 0.006 |
| 930.0 | 0.006 |
| 929.0 | 0.006 |
| 928.0 | 0.006 |
| 927.0 | 0.006 |
| 926.0 | 0.006 |
| 925.0 | 0.007 |
| 924.0 | 0.007 |
| 923.0 | 0.007 |
| 922.0 | 0.007 |
| 921.0 | 0.007 |
| 920.0 | 0.007 |
| 919.0 | 0.007 |
| 918.0 | 0.007 |
| 917.0 | 0.007 |
| 916.0 | 0.007 |
| 915.0 | 0.007 |
| 914.0 | 0.007 |
| 913.0 | 0.007 |
| 912.0 | 0.008 |
| 911.0 | 0.008 |
| 910.0 | 0.008 |
| 909.0 | 0.008 |
| 908.0 | 0.008 |
| 907.0 | 0.008 |
| 906.0 | 0.008 |
| 905.0 | 0.008 |
| 904.0 | 0.008 |
| 903.0 | 0.008 |
| 902.0 | 0.008 |
| 901.0 | 0.009 |
| 900.0 | 0.009 |
| 899.0 | 0.009 |
| 898.0 | 0.009 |
| 897.0 | 0.009 |
| 896.0 | 0.009 |
| 895.0 | 0.009 |
| 894.0 | 0.009 |
| 893.0 | 0.009 |
| 892.0 | 0.009 |
| 891.0 | 0.009 |
| 890.0 | 0.009 |
| 889.0 | 0.01 |
| 888.0 | 0.01 |
| 887.0 | 0.01 |
| 886.0 | 0.01 |
| 885.0 | 0.01 |
| 884.0 | 0.01 |
| 883.0 | 0.01 |
| 882.0 | 0.01 |
| 881.0 | 0.01 |
| 880.0 | 0.01 |
| 879.0 | 0.01 |
| 878.0 | 0.01 |
| 877.0 | 0.01 |
| 876.0 | 0.01 |
| 875.0 | 0.01 |
| 874.0 | 0.01 |
| 873.0 | 0.01 |
| 872.0 | 0.01 |
| 871.0 | 0.01 |
| 870.0 | 0.01 |
| 869.0 | 0.01 |
| 868.0 | 0.009 |
| 867.0 | 0.009 |
| 866.0 | 0.009 |
| 865.0 | 0.009 |
| 864.0 | 0.008 |
| 863.0 | 0.008 |
| 862.0 | 0.008 |
| 861.0 | 0.007 |
| 860.0 | 0.007 |
| 859.0 | 0.007 |
| 858.0 | 0.006 |
| 857.0 | 0.006 |
| 856.0 | 0.006 |
| 855.0 | 0.006 |
| 854.0 | 0.005 |
| 853.0 | 0.005 |
| 852.0 | 0.005 |
| 851.0 | 0.005 |
| 850.0 | 0.005 |
| 849.0 | 0.005 |
| 848.0 | 0.005 |
| 847.0 | 0.006 |
| 846.0 | 0.006 |
| 845.0 | 0.006 |
| 844.0 | 0.006 |
| 843.0 | 0.007 |
| 842.0 | 0.007 |
| 841.0 | 0.007 |
| 840.0 | 0.008 |
| 839.0 | 0.008 |
| 838.0 | 0.009 |
| 837.0 | 0.009 |
| 836.0 | 0.009 |
| 835.0 | 0.01 |
| 834.0 | 0.01 |
| 833.0 | 0.01 |
| 832.0 | 0.01 |
| 831.0 | 0.01 |
| 830.0 | 0.01 |
| 829.0 | 0.009 |
| 828.0 | 0.009 |
| 827.0 | 0.009 |
| 826.0 | 0.008 |
| 825.0 | 0.007 |
| 824.0 | 0.007 |
| 823.0 | 0.006 |
| 822.0 | 0.005 |
| 821.0 | 0.005 |
| 820.0 | 0.004 |
| 819.0 | 0.003 |
| 818.0 | 0.003 |
| 817.0 | 0.002 |
| 816.0 | 0.001 |
| 815.0 | 0.001 |
| 814.0 | 0 |
| 813.0 | 0 |
| 812.0 | 0 |
| 811.0 | 0.001 |
| 810.0 | 0.001 |
| 809.0 | 0.001 |
| 808.0 | 0.002 |
| 807.0 | 0.002 |
| 806.0 | 0.002 |
| 805.0 | 0.002 |
| 804.0 | 0.002 |
| 803.0 | 0.002 |
| 802.0 | 0.002 |
| 801.0 | 0.002 |
| 800.0 | 0.002 |
| 799.0 | 0 |
| 798.0 | 0 |
| 797.0 | 0 |
| 796.0 | 0 |
| 795.0 | 0 |
| 794.0 | 0 |
| 793.0 | 0 |
| 792.0 | 0 |
| 791.0 | 0 |
| 790.0 | 0 |
| 789.0 | 0 |
| 788.0 | 0 |
| 787.0 | 0 |
| 786.0 | 0 |
| 785.0 | 0 |
| 784.0 | 0 |
| 783.0 | 0 |
| 782.0 | 0 |
| 781.0 | 0 |
| 780.0 | 0 |
| 779.0 | 0 |
| 778.0 | 0 |
| 777.0 | 0 |
| 776.0 | 0 |
| 775.0 | 0 |
| 774.0 | 0 |
| 773.0 | 0 |
| 772.0 | 0 |
| 771.0 | 0 |
| 770.0 | 0 |
| 769.0 | 0 |
| 768.0 | 0 |
| 767.0 | 0 |
| 766.0 | 0 |
| 765.0 | 0 |
| 764.0 | 0 |
| 763.0 | 0 |
| 762.0 | 0 |
| 761.0 | 0 |
| 760.0 | 0 |
| 759.0 | 0 |
| 758.0 | 0 |
| 757.0 | 0 |
| 756.0 | 0 |
| 755.0 | 0 |
| 754.0 | 0 |
| 753.0 | 0 |
| 752.0 | 0 |
| 751.0 | 0 |
| 750.0 | 0 |
| 749.0 | 0 |
| 748.0 | 0 |
| 747.0 | 0 |
| 746.0 | 0 |
| 745.0 | 0 |
| 744.0 | 0 |
| 743.0 | 0 |
| 742.0 | 0 |
| 741.0 | 0 |
| 740.0 | 0 |
| 739.0 | 0 |
| 738.0 | 0 |
| 737.0 | 0 |
| 736.0 | 0 |
| 735.0 | 0 |
| 734.0 | 0 |
| 733.0 | 0 |
| 732.0 | 0 |
| 731.0 | 0 |
| 730.0 | 0 |
| 729.0 | 0 |
| 728.0 | 0 |
| 727.0 | 0 |
| 726.0 | 0 |
| 725.0 | 0 |
| 724.0 | 0 |
| 723.0 | 0 |
| 722.0 | 0 |
| 721.0 | 0 |
| 720.0 | 0 |
| 719.0 | 0 |
| 718.0 | 0 |
| 717.0 | 0 |
| 716.0 | 0 |
| 715.0 | 0 |
| 714.0 | 0 |
| 713.0 | 0 |
| 712.0 | 0 |
| 711.0 | 0 |
| 710.0 | 0 |
| 709.0 | 0 |
| 708.0 | 0 |
| 707.0 | 0.001 |
| 706.0 | 0.001 |
| 705.0 | 0.001 |
| 704.0 | 0.001 |
| 703.0 | 0.001 |
| 702.0 | 0.001 |
| 701.0 | 0.001 |
| 700.0 | 0.002 |
| 699.0 | 0.002 |
| 698.0 | 0.002 |
| 697.0 | 0.003 |
| 696.0 | 0.004 |
| 695.0 | 0.005 |
| 694.0 | 0.006 |
| 693.0 | 0.007 |
| 692.0 | 0.01 |
| 691.0 | 0.013 |
| 690.0 | 0.017 |
| 689.0 | 0.023 |
| 688.0 | 0.032 |
| 687.0 | 0.044 |
| 686.0 | 0.064 |
| 685.0 | 0.096 |
| 684.0 | 0.15 |
| 683.0 | 0.241 |
| 682.0 | 0.403 |
| 681.0 | 0.713 |
| 680.0 | 1.351 |
| 679.0 | 2.74 |
| 678.0 | 6.06 |
| 677.0 | 12.744 |
| 676.0 | 28.071 |
| 675.0 | 45.828 |
| 674.0 | 58.18 |
| 673.0 | 62.007 |
| 672.0 | 61.995 |
| 671.0 | 62.026 |
| 670.0 | 62.238 |
| 669.0 | 61.194 |
| 668.0 | 56.705 |
| 667.0 | 46.619 |
| 666.0 | 32.004 |
| 665.0 | 17.984 |
| 664.0 | 8.877 |
| 663.0 | 4.169 |
| 662.0 | 2.016 |
| 661.0 | 1.035 |
| 660.0 | 0.564 |
| 659.0 | 0.327 |
| 658.0 | 0.197 |
| 657.0 | 0.124 |
| 656.0 | 0.081 |
| 655.0 | 0.054 |
| 654.0 | 0.038 |
| 653.0 | 0.026 |
| 652.0 | 0.019 |
| 651.0 | 0.014 |
| 650.0 | 0.011 |
| 649.0 | 0.008 |
| 648.0 | 0.006 |
| 647.0 | 0.005 |
| 646.0 | 0.004 |
| 645.0 | 0.003 |
| 644.0 | 0.003 |
| 643.0 | 0.002 |
| 642.0 | 0.002 |
| 641.0 | 0.001 |
| 640.0 | 0.001 |
| 639.0 | 0.001 |
| 638.0 | 0.001 |
| 637.0 | 0.001 |
| 636.0 | 0.001 |
| 635.0 | 0.001 |
| 634.0 | 0 |
| 633.0 | 0 |
| 632.0 | 0 |
| 631.0 | 0 |
| 630.0 | 0 |
| 629.0 | 0 |
| 628.0 | 0 |
| 627.0 | 0 |
| 626.0 | 0 |
| 625.0 | 0 |
| 624.0 | 0 |
| 623.0 | 0 |
| 622.0 | 0 |
| 621.0 | 0 |
| 620.0 | 0 |
| 619.0 | 0 |
| 618.0 | 0 |
| 617.0 | 0 |
| 616.0 | 0 |
| 615.0 | 0 |
| 614.0 | 0 |
| 613.0 | 0 |
| 612.0 | 0 |
| 611.0 | 0 |
| 610.0 | 0 |
| 609.0 | 0 |
| 608.0 | 0 |
| 607.0 | 0 |
| 606.0 | 0 |
| 605.0 | 0 |
| 604.0 | 0 |
| 603.0 | 0 |
| 602.0 | 0 |
| 601.0 | 0 |
| 600.0 | 0 |
| 599.0 | 0 |
| 598.0 | 0 |
| 597.0 | 0 |
| 596.0 | 0 |
| 595.0 | 0 |
| 594.0 | 0 |
| 593.0 | 0 |
| 592.0 | 0 |
| 591.0 | 0 |
| 590.0 | 0 |
| 589.0 | 0 |
| 588.0 | 0 |
| 587.0 | 0 |
| 586.0 | 0 |
| 585.0 | 0 |
| 584.0 | 0 |
| 583.0 | 0 |
| 582.0 | 0 |
| 581.0 | 0 |
| 580.0 | 0 |
| 579.0 | 0 |
| 578.0 | 0 |
| 577.0 | 0 |
| 576.0 | 0 |
| 575.0 | 0 |
| 574.0 | 0 |
| 573.0 | 0 |
| 572.0 | 0 |
| 571.0 | 0 |
| 570.0 | 0 |
| 569.0 | 0 |
| 568.0 | 0 |
| 567.0 | 0 |
| 566.0 | 0 |
| 565.0 | 0 |
| 564.0 | 0 |
| 563.0 | 0 |
| 562.0 | 0 |
| 561.0 | 0 |
| 560.0 | 0 |
| 559.0 | 0 |
| 558.0 | 0 |
| 557.0 | 0 |
| 556.0 | 0 |
| 555.0 | 0 |
| 554.0 | 0 |
| 553.0 | 0 |
| 552.0 | 0 |
| 551.0 | 0 |
| 550.0 | 0 |
| 549.0 | 0 |
| 548.0 | 0 |
| 547.0 | 0 |
| 546.0 | 0 |
| 545.0 | 0 |
| 544.0 | 0 |
| 543.0 | 0 |
| 542.0 | 0 |
| 541.0 | 0 |
| 540.0 | 0 |
| 539.0 | 0 |
| 538.0 | 0 |
| 537.0 | 0 |
| 536.0 | 0 |
| 535.0 | 0 |
| 534.0 | 0 |
| 533.0 | 0 |
| 532.0 | 0 |
| 531.0 | 0 |
| 530.0 | 0 |
| 529.0 | 0 |
| 528.0 | 0 |
| 527.0 | 0 |
| 526.0 | 0 |
| 525.0 | 0 |
| 524.0 | 0 |
| 523.0 | 0 |
| 522.0 | 0 |
| 521.0 | 0 |
| 520.0 | 0 |
| 519.0 | 0 |
| 518.0 | 0 |
| 517.0 | 0 |
| 516.0 | 0 |
| 515.0 | 0 |
| 514.0 | 0 |
| 513.0 | 0 |
| 512.0 | 0 |
| 511.0 | 0 |
| 510.0 | 0 |
| 509.0 | 0 |
| 508.0 | 0 |
| 507.0 | 0 |
| 506.0 | 0 |
| 505.0 | 0 |
| 504.0 | 0 |
| 503.0 | 0 |
| 502.0 | 0 |
| 501.0 | 0 |
| 500.0 | 0 |
| 499.0 | 0 |
| 498.0 | 0 |
| 497.0 | 0 |
| 496.0 | 0 |
| 495.0 | 0 |
| 494.0 | 0 |
| 493.0 | 0 |
| 492.0 | 0 |
| 491.0 | 0 |
| 490.0 | 0 |
| 489.0 | 0 |
| 488.0 | 0 |
| 487.0 | 0 |
| 486.0 | 0 |
| 485.0 | 0 |
| 484.0 | 0 |
| 483.0 | 0 |
| 482.0 | 0 |
| 481.0 | 0 |
| 480.0 | 0 |
| 479.0 | 0 |
| 478.0 | 0 |
| 477.0 | 0 |
| 476.0 | 0 |
| 475.0 | 0 |
| 474.0 | 0 |
| 473.0 | 0 |
| 472.0 | 0 |
| 471.0 | 0 |
| 470.0 | 0 |
| 469.0 | 0 |
| 468.0 | 0 |
| 467.0 | 0 |
| 466.0 | 0 |
| 465.0 | 0 |
| 464.0 | 0 |
| 463.0 | 0 |
| 462.0 | 0 |
| 461.0 | 0 |
| 460.0 | 0 |
| 459.0 | 0 |
| 458.0 | 0 |
| 457.0 | 0 |
| 456.0 | 0 |
| 455.0 | 0 |
| 454.0 | 0 |
| 453.0 | 0 |
| 452.0 | 0 |
| 451.0 | 0 |
| 450.0 | 0 |
| 449.0 | 0 |
| 448.0 | 0 |
| 447.0 | 0 |
| 446.0 | 0 |
| 445.0 | 0 |
| 444.0 | 0 |
| 443.0 | 0 |
| 442.0 | 0 |
| 441.0 | 0 |
| 440.0 | 0 |
| 439.0 | 0 |
| 438.0 | 0 |
| 437.0 | 0 |
| 436.0 | 0 |
| 435.0 | 0 |
| 434.0 | 0 |
| 433.0 | 0 |
| 432.0 | 0 |
| 431.0 | 0 |
| 430.0 | 0 |
| 429.0 | 0 |
| 428.0 | 0 |
| 427.0 | 0 |
| 426.0 | 0 |
| 425.0 | 0 |
| 424.0 | 0 |
| 423.0 | 0 |
| 422.0 | 0 |
| 421.0 | 0 |
| 420.0 | 0 |
| 419.0 | 0 |
| 418.0 | 0 |
| 417.0 | 0 |
| 416.0 | 0 |
| 415.0 | 0 |
| 414.0 | 0 |
| 413.0 | 0 |
| 412.0 | 0 |
| 411.0 | 0 |
| 410.0 | 0 |
| 409.0 | 0 |
| 408.0 | 0 |
| 407.0 | 0 |
| 406.0 | 0 |
| 405.0 | 0 |
| 404.0 | 0 |
| 403.0 | 0 |
| 402.0 | 0 |
| 401.0 | 0 |
| 400.0 | 0 |
| 399.0 | 0 |
| 398.0 | 0 |
| 397.0 | 0 |
| 396.0 | 0 |
| 395.0 | 0 |
| 394.0 | 0 |
| 393.0 | 0 |
| 392.0 | 0 |
| 391.0 | 0 |
| 390.0 | 0 |
| 389.0 | 0 |
| 388.0 | 0 |
| 387.0 | 0 |
| 386.0 | 0 |
| 385.0 | 0 |
| 384.0 | 0 |
| 383.0 | 0 |
| 382.0 | 0 |
| 381.0 | 0 |
| 380.0 | 0 |
| 379.0 | 0 |
| 378.0 | 0 |
| 377.0 | 0 |
| 376.0 | 0 |
| 375.0 | 0 |
| 374.0 | 0 |
| 373.0 | 0 |
| 372.0 | 0 |
| 371.0 | 0 |
| 370.0 | 0 |
| 369.0 | 0 |
| 368.0 | 0 |
| 367.0 | 0 |
| 366.0 | 0 |
| 365.0 | 0 |
| 364.0 | 0 |
| 363.0 | 0 |
| 362.0 | 0 |
| 361.0 | 0 |
| 360.0 | 0 |
| 359.0 | 0 |
| 358.0 | 0 |
| 357.0 | 0 |
| 356.0 | 0 |
| 355.0 | 0 |
| 354.0 | 0 |
| 353.0 | 0 |
| 352.0 | 0 |
| 351.0 | 0 |
| 350.0 | 0 |
| 349.0 | 0 |
| 348.0 | 0 |
| 347.0 | 0 |
| 346.0 | 0 |
| 345.0 | 0 |
| 344.0 | 0 |
| 343.0 | 0 |
| 342.0 | 0 |
| 341.0 | 0 |
| 340.0 | 0 |
| 339.0 | 0 |
| 338.0 | 0 |
| 337.0 | 0 |
| 336.0 | 0 |
| 335.0 | 0 |
| 334.0 | 0 |
| 333.0 | 0 |
| 332.0 | 0 |
| 331.0 | 0 |
| 330.0 | 0 |
| 329.0 | 0 |
| 328.0 | 0 |
| 327.0 | 0 |
| 326.0 | 0 |
| 325.0 | 0 |
| 324.0 | 0 |
| 323.0 | 0 |
| 322.0 | 0 |
| 321.0 | 0 |
| 320.0 | 0 |
| 319.0 | 0 |
| 318.0 | 0 |
| 317.0 | 0 |
| 316.0 | 0 |
| 315.0 | 0 |
| 314.0 | 0 |
| 313.0 | 0 |
| 312.0 | 0 |
| 311.0 | 0 |
| 310.0 | 0 |
| 309.0 | 0 |
| 308.0 | 0 |
| 307.0 | 0 |
| 306.0 | 0 |
| 305.0 | 0 |
| 304.0 | 0 |
| 303.0 | 0 |
| 302.0 | 0 |
| 301.0 | 0 |
| 300.0 | 0 |
| 299.0 | 0 |
| 298.0 | 0 |
| 297.0 | 0 |
| 296.0 | 0 |
| 295.0 | 0 |
| 294.0 | 0 |
| 293.0 | 0 |
| 292.0 | 0 |
| 291.0 | 0 |
| 290.0 | 0 |
| 289.0 | 0 |
| 288.0 | 0 |
| 287.0 | 0 |
| 286.0 | 0 |
| 285.0 | 0 |
| 284.0 | 0 |
| 283.0 | 0 |
| 282.0 | 0 |
| 281.0 | 0 |
| 280.0 | 0 |
| 279.0 | 0 |
| 278.0 | 0 |
| 277.0 | 0 |
| 276.0 | 0 |
| 275.0 | 0 |
| 274.0 | 0 |
| 273.0 | 0 |
| 272.0 | 0 |
| 271.0 | 0 |
| 270.0 | 0 |
| 269.0 | 0 |
| 268.0 | 0 |
| 267.0 | 0 |
| 266.0 | 0 |
| 265.0 | 0 |
| 264.0 | 0 |
| 263.0 | 0 |
| 262.0 | 0 |
| 261.0 | 0 |
| 260.0 | 0 |
| 259.0 | 0 |
| 258.0 | 0 |
| 257.0 | 0 |
| 256.0 | 0 |
| 255.0 | 0 |
| 254.0 | 0 |
| 253.0 | 0 |
| 252.0 | 0 |
| 251.0 | 0 |
| 250.0 | 0 |
| 249.0 | 0 |
| 248.0 | 0 |
| 247.0 | 0 |
| 246.0 | 0 |
| 245.0 | 0 |
| 244.0 | 0 |
| 243.0 | 0 |
| 242.0 | 0 |
| 241.0 | 0 |
| 240.0 | 0 |
| 239.0 | 0 |
| 238.0 | 0 |
| 237.0 | 0 |
| 236.0 | 0 |
| 235.0 | 0 |
| 234.0 | 0 |
| 233.0 | 0 |
| 232.0 | 0 |
| 231.0 | 0 |
| 230.0 | 0 |
| 229.0 | 0 |
| 228.0 | 0 |
| 227.0 | 0 |
| 226.0 | 0 |
| 225.0 | 0 |
| 224.0 | 0 |
| 223.0 | 0 |
| 222.0 | 0 |
| 221.0 | 0 |
| 220.0 | 0 |
| 219.0 | 0 |
| 218.0 | 0 |
| 217.0 | 0 |
| 216.0 | 0 |
| 215.0 | 0 |
| 214.0 | 0 |
| 213.0 | 0 |
| 212.0 | 0 |
| 211.0 | 0 |
| 210.0 | 0 |
| 209.0 | 0 |
| 208.0 | 0 |
| 207.0 | 0 |
| 206.0 | 0 |
| 205.0 | 0 |
| 204.0 | 0 |
| 203.0 | 0 |
| 202.0 | 0 |
| 201.0 | 0 |